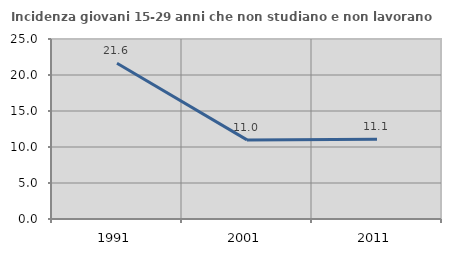
| Category | Incidenza giovani 15-29 anni che non studiano e non lavorano  |
|---|---|
| 1991.0 | 21.635 |
| 2001.0 | 10.985 |
| 2011.0 | 11.069 |